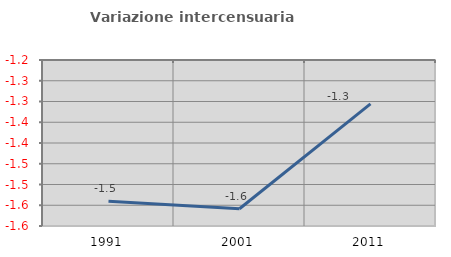
| Category | Variazione intercensuaria annua |
|---|---|
| 1991.0 | -1.54 |
| 2001.0 | -1.559 |
| 2011.0 | -1.306 |